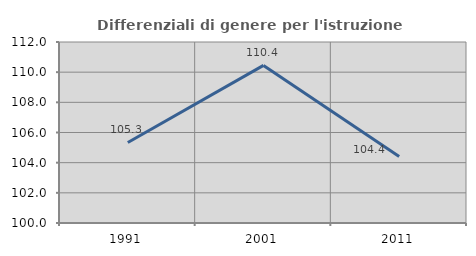
| Category | Differenziali di genere per l'istruzione superiore |
|---|---|
| 1991.0 | 105.34 |
| 2001.0 | 110.449 |
| 2011.0 | 104.404 |